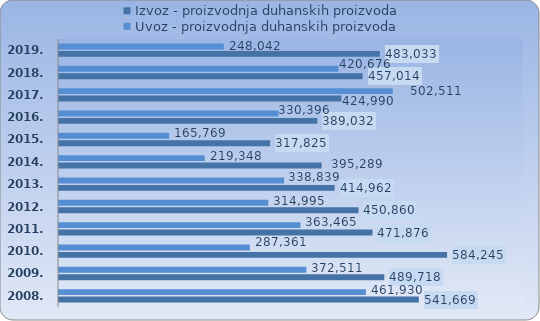
| Category | Izvoz - proizvodnja duhanskih proizvoda | Uvoz - proizvodnja duhanskih proizvoda |
|---|---|---|
| 2008.  | 541669.036 | 461930.043 |
| 2009.  | 489717.667 | 372510.85 |
| 2010.  | 584245.012 | 287360.864 |
| 2011.  | 471876.364 | 363465.04 |
| 2012.  | 450859.694 | 314994.868 |
| 2013.  | 414962.214 | 338838.737 |
| 2014.  | 395289.06 | 219347.944 |
| 2015.  | 317824.81 | 165768.822 |
| 2016.  | 389032.255 | 330395.695 |
| 2017. | 424989.619 | 502511.108 |
| 2018. | 457014.129 | 420675.717 |
| 2019. | 483032.818 | 248041.644 |